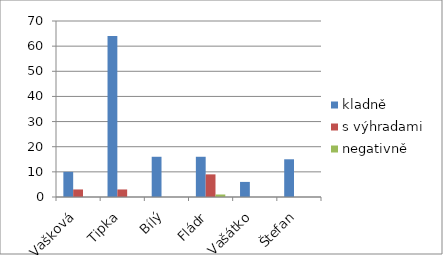
| Category | kladně | s výhradami | negativně |
|---|---|---|---|
| Vašková | 10 | 3 | 0 |
| Tipka | 64 | 3 | 0 |
| Bílý | 16 | 0 | 0 |
| Fládr | 16 | 9 | 1 |
| Vašátko | 6 | 0 | 0 |
| Štefan | 15 | 0 | 0 |